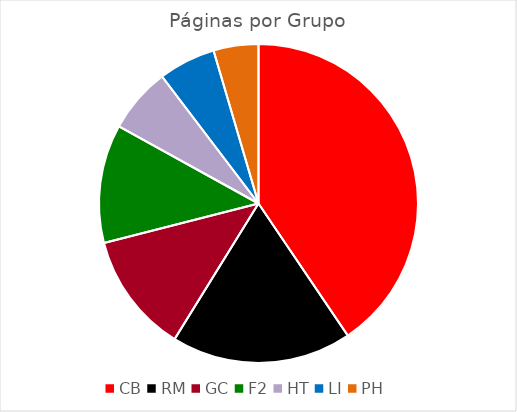
| Category | Series 0 |
|---|---|
| CB | 3136 |
| RM | 1414 |
| GC | 944 |
| F2 | 930 |
| HT | 512 |
| LI | 448 |
| PH | 352 |